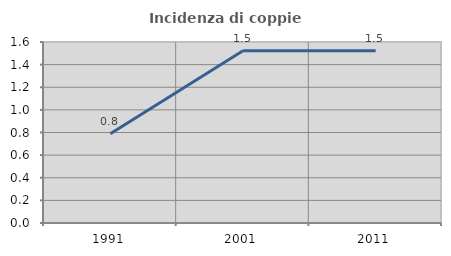
| Category | Incidenza di coppie miste |
|---|---|
| 1991.0 | 0.79 |
| 2001.0 | 1.523 |
| 2011.0 | 1.523 |